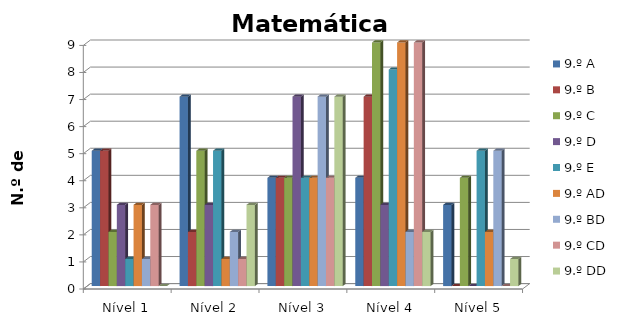
| Category | 9.º A | 9.º B | 9.º C | 9.º D | 9.º E | 9.º AD | 9.º BD | 9.º CD | 9.º DD |
|---|---|---|---|---|---|---|---|---|---|
| Nível 1 | 5 | 5 | 2 | 3 | 1 | 3 | 1 | 3 | 0 |
| Nível 2 | 7 | 2 | 5 | 3 | 5 | 1 | 2 | 1 | 3 |
| Nível 3 | 4 | 4 | 4 | 7 | 4 | 4 | 7 | 4 | 7 |
| Nível 4 | 4 | 7 | 9 | 3 | 8 | 9 | 2 | 9 | 2 |
| Nível 5 | 3 | 0 | 4 | 0 | 5 | 2 | 5 | 0 | 1 |